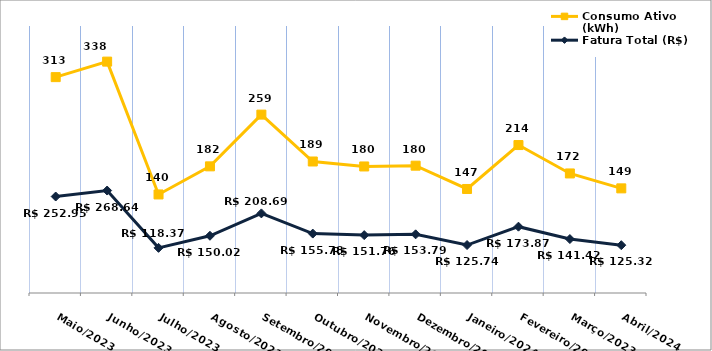
| Category | Fatura Total (R$) | Consumo Ativo (kWh) |
|---|---|---|
| Maio/2023 | 252.95 | 313 |
| Junho/2023 | 268.64 | 338 |
| Julho/2023 | 118.37 | 140 |
| Agosto/2023 | 150.02 | 182 |
| Setembro/2023 | 208.69 | 259 |
| Outubro/2023 | 155.78 | 189 |
| Novembro/2023 | 151.76 | 180 |
| Dezembro/2023 | 153.79 | 180 |
| Janeiro/2024 | 125.74 | 147 |
| Fevereiro/2023 | 173.87 | 214 |
| Março/2023 | 141.42 | 172 |
| Abril/2024 | 125.32 | 149 |